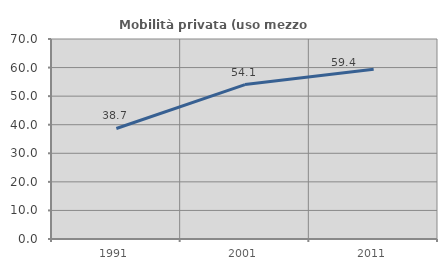
| Category | Mobilità privata (uso mezzo privato) |
|---|---|
| 1991.0 | 38.689 |
| 2001.0 | 54.053 |
| 2011.0 | 59.397 |